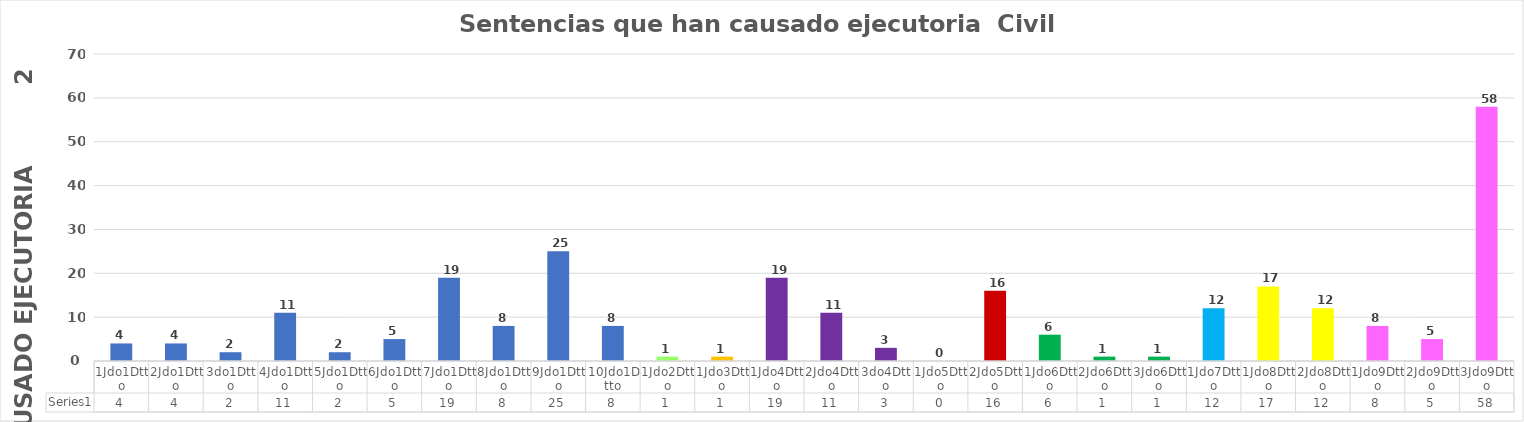
| Category | Series 0 |
|---|---|
| 1Jdo1Dtto | 4 |
| 2Jdo1Dtto | 4 |
| 3do1Dtto | 2 |
| 4Jdo1Dtto | 11 |
| 5Jdo1Dtto | 2 |
| 6Jdo1Dtto | 5 |
| 7Jdo1Dtto | 19 |
| 8Jdo1Dtto | 8 |
| 9Jdo1Dtto | 25 |
| 10Jdo1Dtto | 8 |
| 1Jdo2Dtto | 1 |
| 1Jdo3Dtto | 1 |
| 1Jdo4Dtto | 19 |
| 2Jdo4Dtto | 11 |
| 3do4Dtto | 3 |
| 1Jdo5Dtto | 0 |
| 2Jdo5Dtto | 16 |
| 1Jdo6Dtto | 6 |
| 2Jdo6Dtto | 1 |
| 3Jdo6Dtto | 1 |
| 1Jdo7Dtto | 12 |
| 1Jdo8Dtto | 17 |
| 2Jdo8Dtto | 12 |
| 1Jdo9Dtto | 8 |
| 2Jdo9Dtto | 5 |
| 3Jdo9Dtto | 58 |